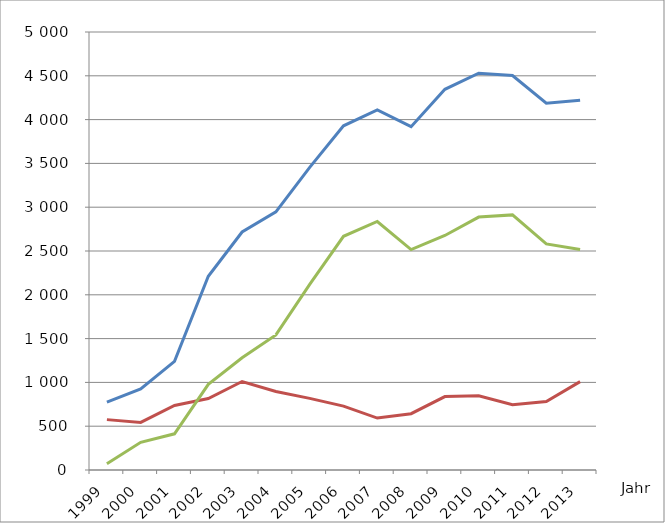
| Category | Verfahren
Insgesamt | von 
Unternehmen1 | von 
Verbrauchern |
|---|---|---|---|
| 1999.0 | 775 | 575 | 71 |
| 2000.0 | 926 | 543 | 316 |
| 2001.0 | 1241 | 737 | 413 |
| 2002.0 | 2211 | 816 | 978 |
| 2003.0 | 2717 | 1010 | 1281 |
| 2004.0 | 2947 | 896 | 1542 |
| 2005.0 | 3455 | 818 | 2119 |
| 2006.0 | 3929 | 729 | 2668 |
| 2007.0 | 4110 | 593 | 2837 |
| 2008.0 | 3919 | 643 | 2516 |
| 2009.0 | 4346 | 838 | 2677 |
| 2010.0 | 4530 | 847 | 2887 |
| 2011.0 | 4503 | 745 | 2912 |
| 2012.0 | 4188 | 781 | 2581 |
| 2013.0 | 4220 | 1009 | 2516 |